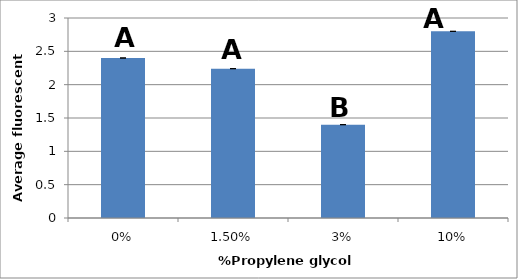
| Category | Series 0 |
|---|---|
| 0.0 | 2.4 |
| 0.015 | 2.24 |
| 0.03 | 1.4 |
| 0.1 | 2.8 |